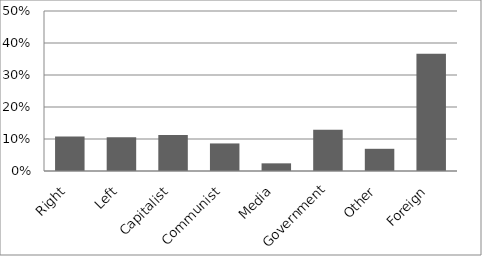
| Category | Series 0 |
|---|---|
| Right | 0.108 |
| Left | 0.105 |
| Capitalist | 0.112 |
| Communist | 0.086 |
| Media | 0.024 |
| Government | 0.129 |
| Other | 0.069 |
| Foreign | 0.366 |